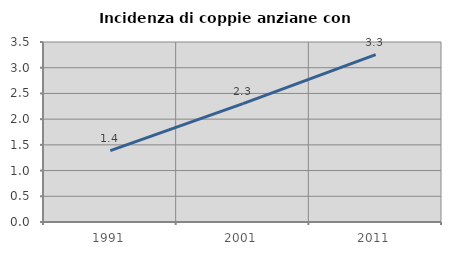
| Category | Incidenza di coppie anziane con figli |
|---|---|
| 1991.0 | 1.389 |
| 2001.0 | 2.303 |
| 2011.0 | 3.253 |